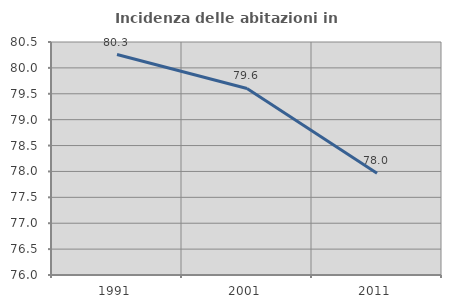
| Category | Incidenza delle abitazioni in proprietà  |
|---|---|
| 1991.0 | 80.258 |
| 2001.0 | 79.602 |
| 2011.0 | 77.965 |